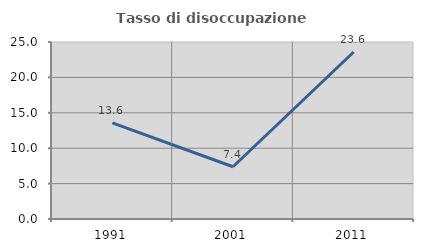
| Category | Tasso di disoccupazione giovanile  |
|---|---|
| 1991.0 | 13.568 |
| 2001.0 | 7.377 |
| 2011.0 | 23.585 |